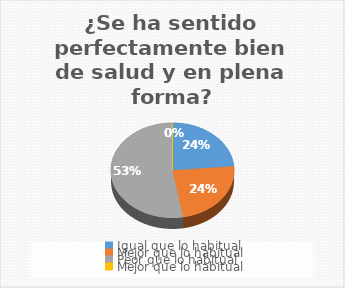
| Category | 1 |
|---|---|
| Igual que lo habitual | 26 |
| Mejor que lo habitual | 26 |
| Peor que lo habitual | 58 |
| Mejor que lo habitual | 0 |